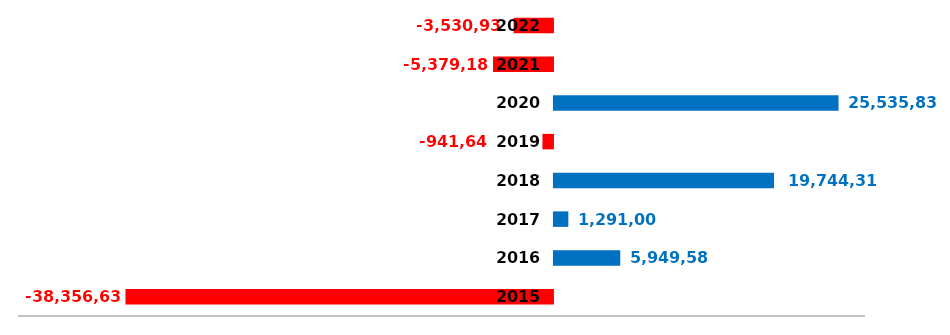
| Category | Risultato dell'esercizio |
|---|---|
| 2015.0 | -38356639.21 |
| 2016.0 | 5949583.27 |
| 2017.0 | 1291007.08 |
| 2018.0 | 19744316.59 |
| 2019.0 | -941639.55 |
| 2020.0 | 25535832.58 |
| 2021.0 | -5379181.76 |
| 2022.0 | -3530933.96 |